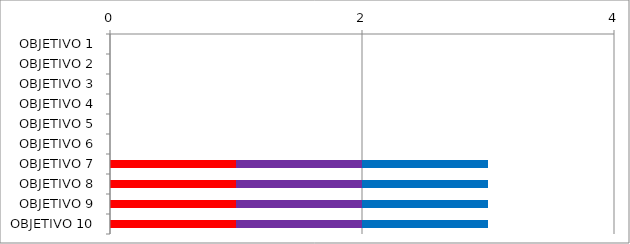
| Category | Series 0 | Series 3 | Series 1 |
|---|---|---|---|
| OBJETIVO 1 | 0 | 0 | 0 |
| OBJETIVO 2 | 0 | 0 | 0 |
| OBJETIVO 3 | 0 | 0 | 0 |
| OBJETIVO 4 | 0 | 0 | 0 |
| OBJETIVO 5 | 0 | 0 | 0 |
| OBJETIVO 6 | 0 | 0 | 0 |
| OBJETIVO 7 | 1 | 1 | 1 |
| OBJETIVO 8 | 1 | 1 | 1 |
| OBJETIVO 9 | 1 | 1 | 1 |
| OBJETIVO 10 | 1 | 1 | 1 |